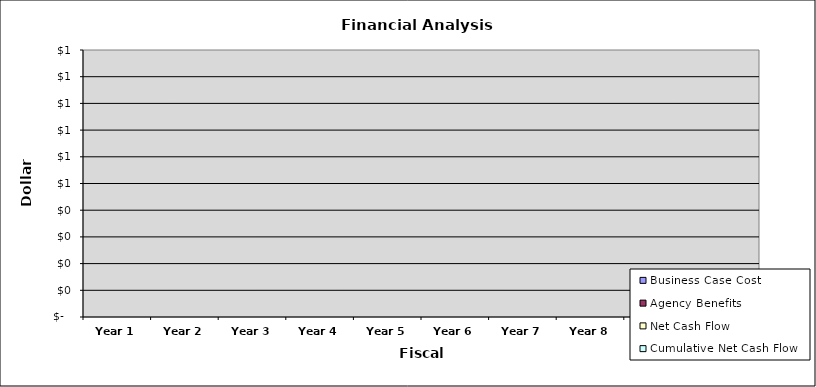
| Category | Business Case Cost | Agency Benefits | Net Cash Flow | Cumulative Net Cash Flow |
|---|---|---|---|---|
| Year 1 | 0 | 0 | 0 | 0 |
| Year 2 | 0 | 0 | 0 | 0 |
| Year 3 | 0 | 0 | 0 | 0 |
| Year 4 | 0 | 0 | 0 | 0 |
| Year 5 | 0 | 0 | 0 | 0 |
| Year 6 | 0 | 0 | 0 | 0 |
| Year 7 | 0 | 0 | 0 | 0 |
| Year 8 | 0 | 0 | 0 | 0 |
| Year 9 | 0 | 0 | 0 | 0 |
| Year 10 | 0 | 0 | 0 | 0 |